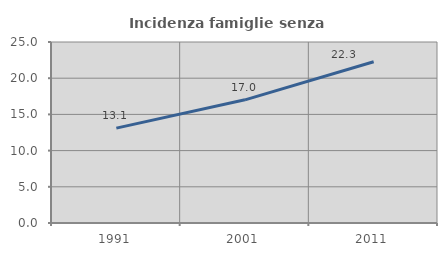
| Category | Incidenza famiglie senza nuclei |
|---|---|
| 1991.0 | 13.108 |
| 2001.0 | 17.012 |
| 2011.0 | 22.278 |